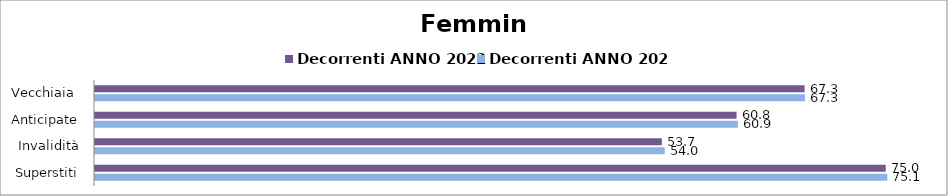
| Category | Decorrenti ANNO 2022 | Decorrenti ANNO 2023 |
|---|---|---|
| Vecchiaia  | 67.26 | 67.3 |
| Anticipate | 60.81 | 60.94 |
| Invalidità | 53.73 | 54 |
| Superstiti | 74.95 | 75.1 |